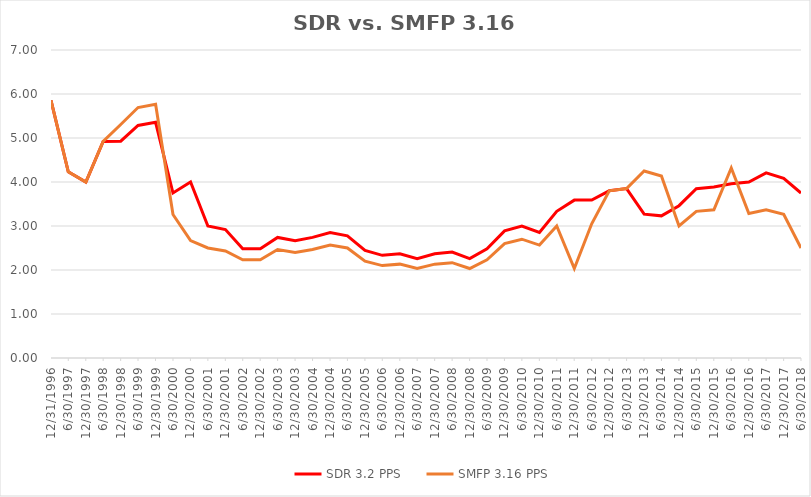
| Category | SDR 3.2 PPS | SMFP 3.16 PPS |
|---|---|---|
| 12/31/96 | 5.857 | 5.857 |
| 6/30/97 | 4.231 | 4.231 |
| 12/31/97 | 4 | 4 |
| 6/30/98 | 4.923 | 4.923 |
| 12/31/98 | 4.929 | 5.308 |
| 6/30/99 | 5.286 | 5.692 |
| 12/31/99 | 5.357 | 5.769 |
| 6/30/00 | 3.75 | 3.261 |
| 12/31/00 | 4 | 2.667 |
| 6/30/01 | 3 | 2.5 |
| 12/31/01 | 2.92 | 2.433 |
| 6/30/02 | 2.481 | 2.233 |
| 12/31/02 | 2.481 | 2.233 |
| 6/30/03 | 2.741 | 2.467 |
| 12/31/03 | 2.667 | 2.4 |
| 6/30/04 | 2.741 | 2.467 |
| 12/31/04 | 2.852 | 2.567 |
| 6/30/05 | 2.778 | 2.5 |
| 12/31/05 | 2.444 | 2.2 |
| 6/30/06 | 2.333 | 2.1 |
| 12/31/06 | 2.37 | 2.133 |
| 6/30/07 | 2.259 | 2.033 |
| 12/31/07 | 2.37 | 2.133 |
| 6/30/08 | 2.407 | 2.167 |
| 12/31/08 | 2.259 | 2.033 |
| 6/30/09 | 2.481 | 2.233 |
| 12/31/09 | 2.889 | 2.6 |
| 6/30/10 | 3 | 2.7 |
| 12/31/10 | 2.852 | 2.567 |
| 6/30/11 | 3.333 | 3 |
| 12/31/11 | 3.588 | 2.033 |
| 6/30/12 | 3.588 | 3.05 |
| 12/31/12 | 3.8 | 3.8 |
| 6/30/13 | 3.85 | 3.85 |
| 12/31/13 | 3.269 | 4.25 |
| 6/30/14 | 3.231 | 4.136 |
| 12/31/14 | 3.462 | 3 |
| 6/30/15 | 3.846 | 3.333 |
| 12/31/15 | 3.885 | 3.367 |
| 6/30/16 | 3.958 | 4.318 |
| 12/31/16 | 4 | 3.284 |
| 6/30/17 | 4.208 | 3.367 |
| 12/31/17 | 4.083 | 3.267 |
| 6/30/18 | 3.75 | 2.5 |